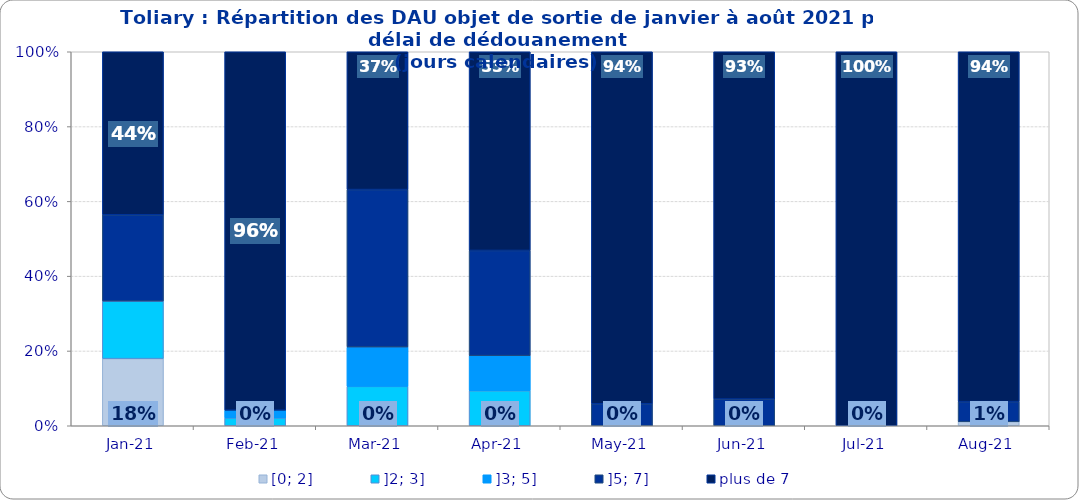
| Category | [0; 2] | ]2; 3] | ]3; 5] | ]5; 7] | plus de 7 |
|---|---|---|---|---|---|
| 2021-01-01 | 0.179 | 0.154 | 0 | 0.231 | 0.436 |
| 2021-02-01 | 0 | 0.021 | 0.021 | 0 | 0.958 |
| 2021-03-01 | 0 | 0.105 | 0.105 | 0.421 | 0.368 |
| 2021-04-01 | 0 | 0.094 | 0.094 | 0.281 | 0.531 |
| 2021-05-01 | 0 | 0 | 0 | 0.059 | 0.941 |
| 2021-06-01 | 0 | 0 | 0 | 0.071 | 0.929 |
| 2021-07-01 | 0 | 0 | 0 | 0 | 1 |
| 2021-08-01 | 0.011 | 0 | 0 | 0.054 | 0.935 |